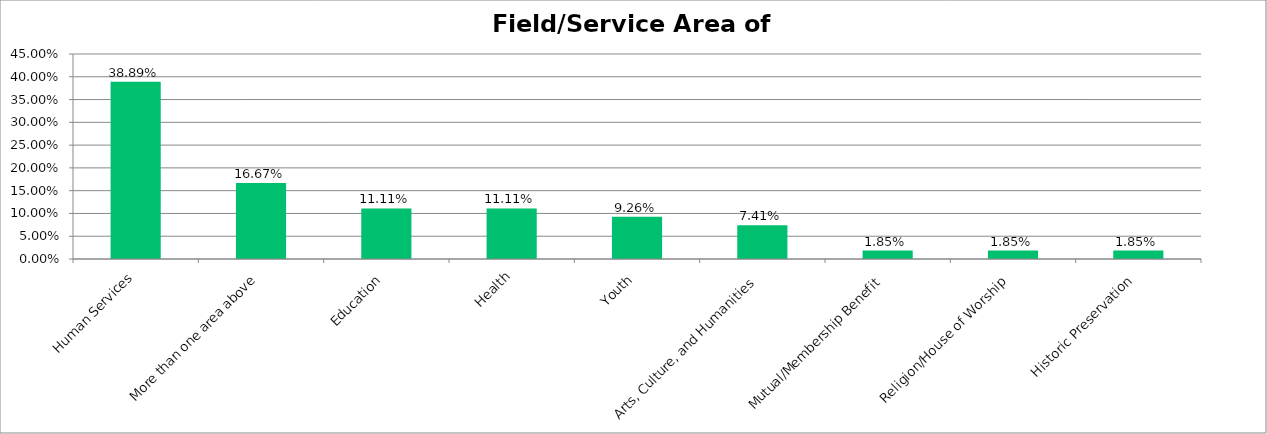
| Category | Responses |
|---|---|
| Human Services | 0.389 |
| More than one area above | 0.167 |
| Education | 0.111 |
| Health | 0.111 |
| Youth | 0.093 |
| Arts, Culture, and Humanities | 0.074 |
| Mutual/Membership Benefit | 0.018 |
| Religion/House of Worship | 0.018 |
| Historic Preservation | 0.018 |